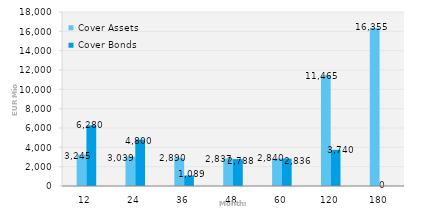
| Category | Cover Assets | Cover Bonds |
|---|---|---|
| 12.0 | 3245.322 | 6280 |
| 24.0 | 3038.597 | 4800 |
| 36.0 | 2890.309 | 1089.444 |
| 48.0 | 2837.371 | 2788 |
| 60.0 | 2840.348 | 2836.41 |
| 120.0 | 11464.588 | 3740 |
| 180.0 | 16355.381 | 0 |